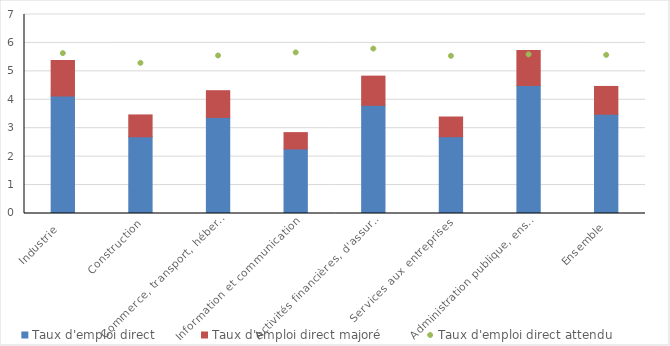
| Category | Taux d'emploi direct | Taux d'emploi direct majoré |
|---|---|---|
| Industrie  | 4.129 | 1.256 |
| Construction | 2.698 | 0.769 |
| Commerce, transport, hébergement et restauration | 3.38 | 0.94 |
| Information et communication | 2.271 | 0.574 |
| Activités financières, d'assurance et immobilières | 3.805 | 1.027 |
| Services aux entreprises | 2.7 | 0.694 |
| Administration publique, enseignement, santé humaine et action sociale** | 4.5 | 1.238 |
| Ensemble | 3.492 | 0.978 |